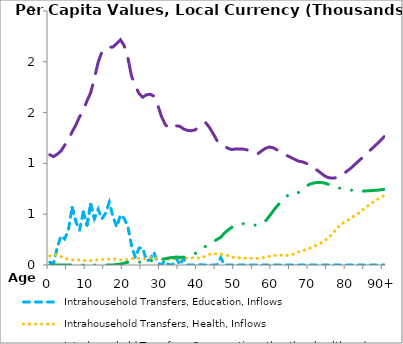
| Category | Intrahousehold Transfers, Education, Inflows | Intrahousehold Transfers, Health, Inflows | Intrahousehold Transfers, Consumption other than health and education, Inflows | Intrahousehold Transfers, Saving, Inflows |
|---|---|---|---|---|
| 0 | 26.769 | 89.592 | 1085.861 | 0 |
|  | 15.471 | 103.66 | 1066.758 | 0 |
| 2 | 172.455 | 102.214 | 1091.044 | 0 |
| 3 | 287.168 | 83.498 | 1122.13 | 0 |
| 4 | 256.398 | 67.364 | 1179.488 | 0 |
| 5 | 346.84 | 54.393 | 1231.318 | 0 |
| 6 | 566.591 | 50.402 | 1311.344 | 0 |
| 7 | 427.505 | 51.481 | 1377.364 | 0 |
| 8 | 342.658 | 49.043 | 1459.037 | 0 |
| 9 | 522.285 | 46.569 | 1521.007 | 0 |
| 10 | 393.25 | 41.438 | 1615.908 | 0 |
| 11 | 597.926 | 42.365 | 1696.265 | 0 |
| 12 | 457.016 | 44.907 | 1840.056 | 0 |
| 13 | 549.544 | 52.385 | 1994.873 | 0 |
| 14 | 453.459 | 55.019 | 2097.254 | 0 |
| 15 | 507.436 | 55.71 | 2131.86 | 0 |
| 16 | 616.752 | 56.652 | 2142.856 | 0 |
| 17 | 476.082 | 59.241 | 2146.045 | 0.881 |
| 18 | 373.478 | 57.412 | 2180.055 | 5.841 |
| 19 | 493.809 | 50.531 | 2217.027 | 9.814 |
| 20 | 459.36 | 47.211 | 2159.614 | 18.507 |
| 21 | 379.07 | 55.477 | 2038.949 | 27.652 |
| 22 | 189.272 | 62.702 | 1857.87 | 32.435 |
| 23 | 72.865 | 65.352 | 1766.037 | 33.851 |
| 24 | 166.302 | 64.777 | 1687.849 | 28.368 |
| 25 | 170.456 | 56.806 | 1651.189 | 26.967 |
| 26 | 37.956 | 64.337 | 1675.34 | 34.535 |
| 27 | 55.67 | 73.758 | 1680.406 | 40.757 |
| 28 | 127.662 | 69.678 | 1662.977 | 45.326 |
| 29 | 23.619 | 66.073 | 1581.151 | 49.665 |
| 30 | 2.022 | 60.122 | 1466.91 | 51.276 |
| 31 | 42.287 | 55.711 | 1386.197 | 61.179 |
| 32 | 2.548 | 57.545 | 1345.079 | 69.426 |
| 33 | 0.608 | 61.14 | 1345.351 | 73.453 |
| 34 | 69.433 | 59.988 | 1370.096 | 76.174 |
| 35 | 1.054 | 59.039 | 1364.996 | 77.243 |
| 36 | 64.192 | 62.807 | 1338.961 | 76.446 |
| 37 | 0 | 68.304 | 1325.483 | 82.328 |
| 38 | 0 | 70.581 | 1321.344 | 92.27 |
| 39 | 0 | 70.934 | 1328.37 | 109.034 |
| 40 | 4.045 | 68.154 | 1351.207 | 138.718 |
| 41 | 1.425 | 72.206 | 1392.707 | 164.81 |
| 42 | 0 | 89.837 | 1398.676 | 184.326 |
| 43 | 0 | 105.734 | 1351.744 | 207.364 |
| 44 | 0 | 110.795 | 1291.187 | 229.825 |
| 45 | 0 | 110.143 | 1224.081 | 251.101 |
| 46 | 73.274 | 108.525 | 1196.808 | 272.947 |
| 47 | 0 | 100.795 | 1172.171 | 314.179 |
| 48 | 0 | 91.27 | 1147.346 | 345.515 |
| 49 | 0 | 77.57 | 1136.47 | 371.125 |
| 50 | 0 | 72.461 | 1142.104 | 388.473 |
| 51 | 0 | 69.824 | 1142.377 | 400.414 |
| 52 | 0 | 67.835 | 1140.47 | 406.351 |
| 53 | 0 | 66.31 | 1133.682 | 407.732 |
| 54 | 0 | 65.282 | 1121.869 | 398.948 |
| 55 | 0 | 64.631 | 1102.028 | 392.746 |
| 56 | 0 | 65.669 | 1095.612 | 394.138 |
| 57 | 0 | 69.811 | 1122.481 | 404.662 |
| 58 | 0 | 76.829 | 1147.697 | 430.656 |
| 59 | 0 | 84.887 | 1160.656 | 475.717 |
| 60 | 0 | 91.598 | 1155.646 | 525.43 |
| 61 | 0 | 96.087 | 1136.054 | 572.163 |
| 62 | 0 | 97.263 | 1114.781 | 613.363 |
| 63 | 0 | 94.8 | 1088.568 | 652.135 |
| 64 | 0 | 94.249 | 1074.616 | 683.991 |
| 65 | 0 | 98.394 | 1056.827 | 700.986 |
| 66 | 0 | 114.769 | 1038.376 | 696.913 |
| 67 | 0 | 130.056 | 1021.253 | 714.604 |
| 68 | 0 | 139.519 | 1015.163 | 744.964 |
| 69 | 0 | 152.135 | 1001.341 | 773.37 |
| 70 | 0 | 165.596 | 980.933 | 796.224 |
| 71 | 0 | 180.511 | 958.625 | 806.521 |
| 72 | 0 | 198.016 | 931.608 | 812.534 |
| 73 | 0 | 217.699 | 904.36 | 811.936 |
| 74 | 0 | 240.235 | 876.445 | 805.933 |
| 75 | 0 | 268.187 | 859.795 | 793.907 |
| 76 | 0 | 303.069 | 854.612 | 777.708 |
| 77 | 0 | 347.545 | 858.806 | 765.488 |
| 78 | 0 | 388.752 | 869.801 | 755.971 |
| 79 | 0 | 414.489 | 893.199 | 749.777 |
| 80 | 0 | 433.767 | 924.176 | 744.43 |
| 81 | 0 | 463.463 | 951.096 | 737.215 |
| 82 | 0 | 483.484 | 985.566 | 732.74 |
| 83 | 0 | 507.028 | 1019.251 | 728.833 |
| 84 | 0 | 533.959 | 1051.929 | 725.919 |
| 85 | 0 | 564.654 | 1085.996 | 728.736 |
| 86 | 0 | 592.393 | 1120.875 | 730.85 |
| 87 | 0 | 618.402 | 1154.726 | 733.044 |
| 88 | 0 | 642.416 | 1189.242 | 736.066 |
| 89 | 0 | 663.904 | 1225.144 | 739.807 |
| 90+ | 0 | 682.549 | 1262.866 | 744.252 |